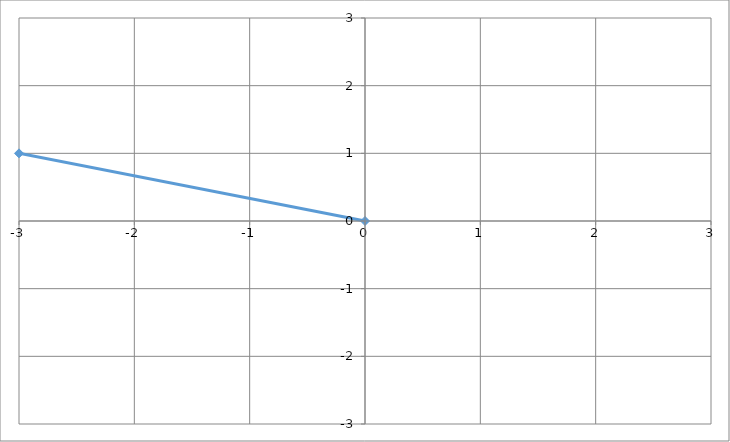
| Category | Series 0 |
|---|---|
| 0.0 | 0 |
| -3.0 | 1 |